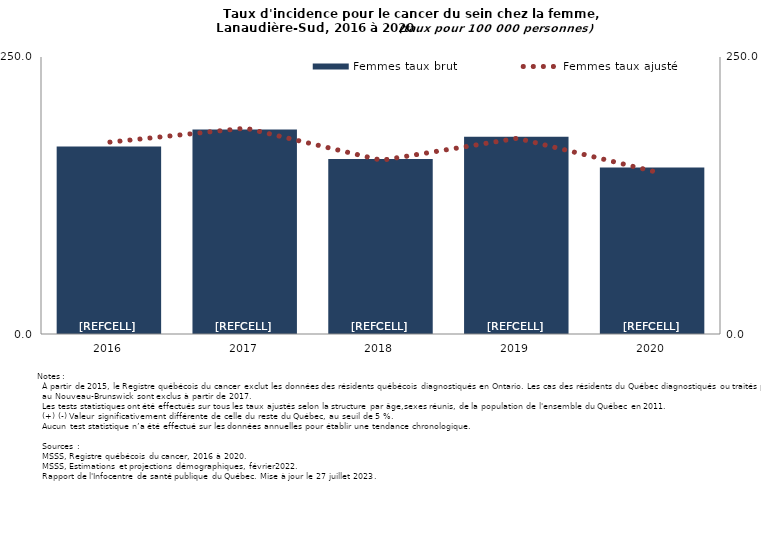
| Category | Femmes taux brut |
|---|---|
| 2016.0 | 169.226 |
| 2017.0 | 184.471 |
| 2018.0 | 158.036 |
| 2019.0 | 178.066 |
| 2020.0 | 150.274 |